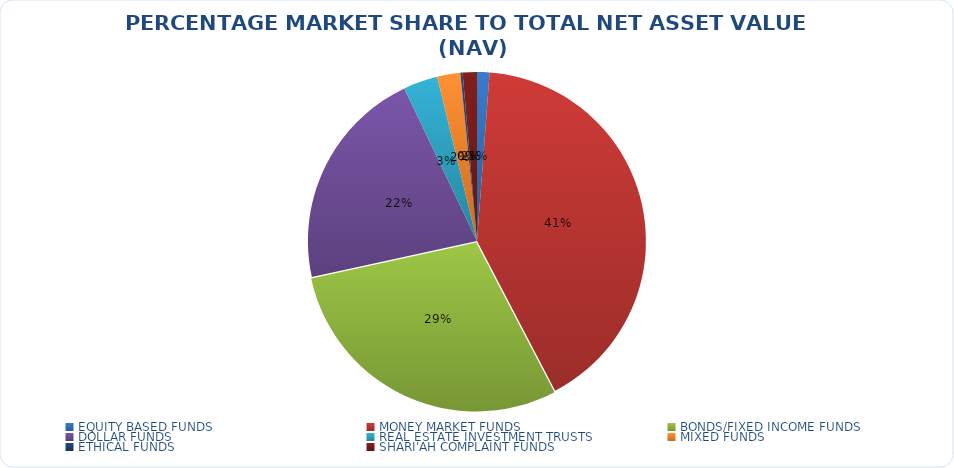
| Category | NET ASSET VALUE |
|---|---|
| EQUITY BASED FUNDS | 16484896751.82 |
| MONEY MARKET FUNDS | 569934985173.196 |
| BONDS/FIXED INCOME FUNDS | 404990211138.24 |
| DOLLAR FUNDS | 295393927748.165 |
| REAL ESTATE INVESTMENT TRUSTS | 45548053984.42 |
| MIXED FUNDS | 30660052006.313 |
| ETHICAL FUNDS | 2958018027.55 |
| SHARI'AH COMPLAINT FUNDS | 18835561545.6 |